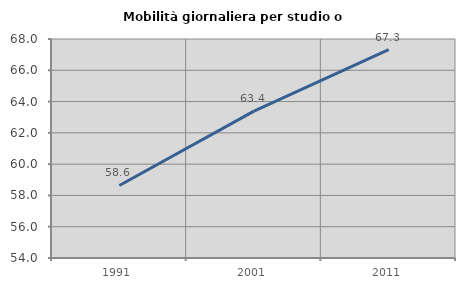
| Category | Mobilità giornaliera per studio o lavoro |
|---|---|
| 1991.0 | 58.638 |
| 2001.0 | 63.391 |
| 2011.0 | 67.315 |